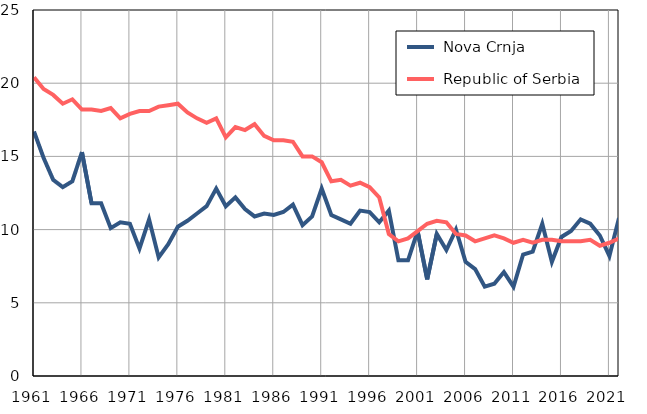
| Category |  Nova Crnja |  Republic of Serbia |
|---|---|---|
| 1961.0 | 16.7 | 20.4 |
| 1962.0 | 14.9 | 19.6 |
| 1963.0 | 13.4 | 19.2 |
| 1964.0 | 12.9 | 18.6 |
| 1965.0 | 13.3 | 18.9 |
| 1966.0 | 15.3 | 18.2 |
| 1967.0 | 11.8 | 18.2 |
| 1968.0 | 11.8 | 18.1 |
| 1969.0 | 10.1 | 18.3 |
| 1970.0 | 10.5 | 17.6 |
| 1971.0 | 10.4 | 17.9 |
| 1972.0 | 8.7 | 18.1 |
| 1973.0 | 10.7 | 18.1 |
| 1974.0 | 8.1 | 18.4 |
| 1975.0 | 9 | 18.5 |
| 1976.0 | 10.2 | 18.6 |
| 1977.0 | 10.6 | 18 |
| 1978.0 | 11.1 | 17.6 |
| 1979.0 | 11.6 | 17.3 |
| 1980.0 | 12.8 | 17.6 |
| 1981.0 | 11.6 | 16.3 |
| 1982.0 | 12.2 | 17 |
| 1983.0 | 11.4 | 16.8 |
| 1984.0 | 10.9 | 17.2 |
| 1985.0 | 11.1 | 16.4 |
| 1986.0 | 11 | 16.1 |
| 1987.0 | 11.2 | 16.1 |
| 1988.0 | 11.7 | 16 |
| 1989.0 | 10.3 | 15 |
| 1990.0 | 10.9 | 15 |
| 1991.0 | 12.8 | 14.6 |
| 1992.0 | 11 | 13.3 |
| 1993.0 | 10.7 | 13.4 |
| 1994.0 | 10.4 | 13 |
| 1995.0 | 11.3 | 13.2 |
| 1996.0 | 11.2 | 12.9 |
| 1997.0 | 10.5 | 12.2 |
| 1998.0 | 11.3 | 9.7 |
| 1999.0 | 7.9 | 9.2 |
| 2000.0 | 7.9 | 9.4 |
| 2001.0 | 9.9 | 9.9 |
| 2002.0 | 6.6 | 10.4 |
| 2003.0 | 9.7 | 10.6 |
| 2004.0 | 8.6 | 10.5 |
| 2005.0 | 10 | 9.7 |
| 2006.0 | 7.8 | 9.6 |
| 2007.0 | 7.3 | 9.2 |
| 2008.0 | 6.1 | 9.4 |
| 2009.0 | 6.3 | 9.6 |
| 2010.0 | 7.1 | 9.4 |
| 2011.0 | 6.1 | 9.1 |
| 2012.0 | 8.3 | 9.3 |
| 2013.0 | 8.5 | 9.1 |
| 2014.0 | 10.4 | 9.3 |
| 2015.0 | 7.8 | 9.3 |
| 2016.0 | 9.5 | 9.2 |
| 2017.0 | 9.9 | 9.2 |
| 2018.0 | 10.7 | 9.2 |
| 2019.0 | 10.4 | 9.3 |
| 2020.0 | 9.6 | 8.9 |
| 2021.0 | 8.2 | 9.1 |
| 2022.0 | 10.8 | 9.4 |